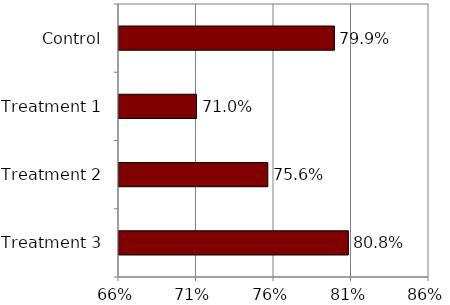
| Category | Series 0 |
|---|---|
| Treatment 3 | 0.808 |
| Treatment 2 | 0.756 |
| Treatment 1 | 0.71 |
| Control | 0.799 |